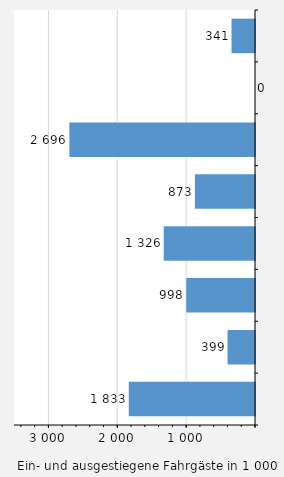
| Category | Fahrgäste |
|---|---|
| Lübeck | 341 |
| Brunsbüttel | 0 |
| Puttgarden / Fehmarn | 2696 |
| Kiel | 873 |
| Dagebüll | 1326 |
| Föhr | 998 |
| List / Sylt | 399 |
| Sonstige Häfen | 1833 |